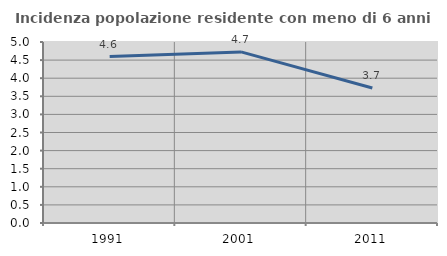
| Category | Incidenza popolazione residente con meno di 6 anni |
|---|---|
| 1991.0 | 4.599 |
| 2001.0 | 4.726 |
| 2011.0 | 3.728 |